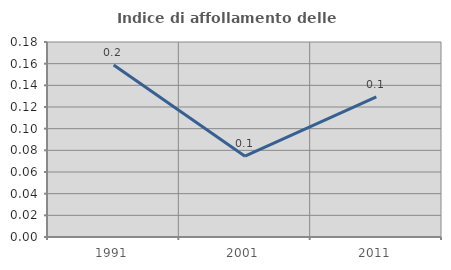
| Category | Indice di affollamento delle abitazioni  |
|---|---|
| 1991.0 | 0.159 |
| 2001.0 | 0.075 |
| 2011.0 | 0.129 |